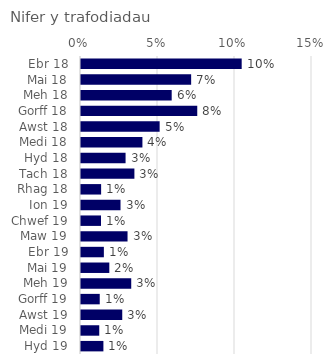
| Category | Nifer y trafodiadau |
|---|---|
| Ebr 18 | 0.104 |
| Mai 18 | 0.072 |
| Meh 18 | 0.059 |
| Gorff 18 | 0.075 |
| Awst 18 | 0.051 |
| Medi 18 | 0.04 |
| Hyd 18 | 0.029 |
| Tach 18 | 0.035 |
| Rhag 18 | 0.013 |
| Ion 19 | 0.026 |
| Chwef 19 | 0.013 |
| Maw 19 | 0.03 |
| Ebr 19 | 0.015 |
| Mai 19 | 0.018 |
| Meh 19 | 0.033 |
| Gorff 19 | 0.012 |
| Awst 19 | 0.027 |
| Medi 19 | 0.012 |
| Hyd 19 | 0.015 |